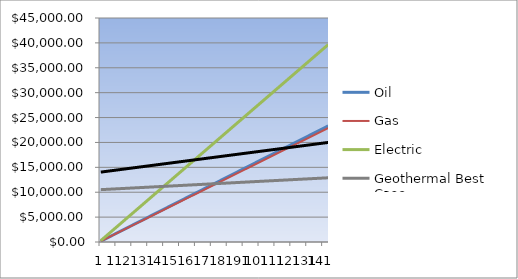
| Category | Oil | Gas | Electric | Geothermal Best Case | Geothermal Worst Case |
|---|---|---|---|---|---|
| 0 | 162 | 158.98 | 275.4 | 10516.66 | 14041.66 |
| 1 | 324 | 317.96 | 550.8 | 10533.32 | 14083.32 |
| 2 | 486 | 476.94 | 826.2 | 10549.98 | 14124.98 |
| 3 | 648 | 635.92 | 1101.6 | 10566.64 | 14166.64 |
| 4 | 810 | 794.9 | 1377 | 10583.3 | 14208.3 |
| 5 | 972 | 953.88 | 1652.4 | 10599.96 | 14249.96 |
| 6 | 1134 | 1112.86 | 1927.8 | 10616.62 | 14291.62 |
| 7 | 1296 | 1271.84 | 2203.2 | 10633.28 | 14333.28 |
| 8 | 1458 | 1430.82 | 2478.6 | 10649.94 | 14374.94 |
| 9 | 1620 | 1589.8 | 2754 | 10666.6 | 14416.6 |
| 10 | 1782 | 1748.78 | 3029.4 | 10683.26 | 14458.26 |
| 11 | 1944 | 1907.76 | 3304.8 | 10699.92 | 14499.92 |
| 12 | 2106 | 2066.74 | 3580.2 | 10716.58 | 14541.58 |
| 13 | 2268 | 2225.72 | 3855.6 | 10733.24 | 14583.24 |
| 14 | 2430 | 2384.7 | 4131 | 10749.9 | 14624.9 |
| 15 | 2592 | 2543.68 | 4406.4 | 10766.56 | 14666.56 |
| 16 | 2754 | 2702.66 | 4681.8 | 10783.22 | 14708.22 |
| 17 | 2916 | 2861.64 | 4957.2 | 10799.88 | 14749.88 |
| 18 | 3078 | 3020.62 | 5232.6 | 10816.54 | 14791.54 |
| 19 | 3240 | 3179.6 | 5508 | 10833.2 | 14833.2 |
| 20 | 3402 | 3338.58 | 5783.4 | 10849.86 | 14874.86 |
| 21 | 3564 | 3497.56 | 6058.8 | 10866.52 | 14916.52 |
| 22 | 3726 | 3656.54 | 6334.2 | 10883.18 | 14958.18 |
| 23 | 3888 | 3815.52 | 6609.6 | 10899.84 | 14999.84 |
| 24 | 4050 | 3974.5 | 6885 | 10916.5 | 15041.5 |
| 25 | 4212 | 4133.48 | 7160.4 | 10933.16 | 15083.16 |
| 26 | 4374 | 4292.46 | 7435.8 | 10949.82 | 15124.82 |
| 27 | 4536 | 4451.44 | 7711.2 | 10966.48 | 15166.48 |
| 28 | 4698 | 4610.42 | 7986.6 | 10983.14 | 15208.14 |
| 29 | 4860 | 4769.4 | 8262 | 10999.8 | 15249.8 |
| 30 | 5022 | 4928.38 | 8537.4 | 11016.46 | 15291.46 |
| 31 | 5184 | 5087.36 | 8812.8 | 11033.12 | 15333.12 |
| 32 | 5346 | 5246.34 | 9088.2 | 11049.78 | 15374.78 |
| 33 | 5508 | 5405.32 | 9363.6 | 11066.44 | 15416.44 |
| 34 | 5670 | 5564.3 | 9639 | 11083.1 | 15458.1 |
| 35 | 5832 | 5723.28 | 9914.4 | 11099.76 | 15499.76 |
| 36 | 5994 | 5882.26 | 10189.8 | 11116.42 | 15541.42 |
| 37 | 6156 | 6041.24 | 10465.2 | 11133.08 | 15583.08 |
| 38 | 6318 | 6200.22 | 10740.6 | 11149.74 | 15624.74 |
| 39 | 6480 | 6359.2 | 11016 | 11166.4 | 15666.4 |
| 40 | 6642 | 6518.18 | 11291.4 | 11183.06 | 15708.06 |
| 41 | 6804 | 6677.16 | 11566.8 | 11199.72 | 15749.72 |
| 42 | 6966 | 6836.14 | 11842.2 | 11216.38 | 15791.38 |
| 43 | 7128 | 6995.12 | 12117.6 | 11233.04 | 15833.04 |
| 44 | 7290 | 7154.1 | 12393 | 11249.7 | 15874.7 |
| 45 | 7452 | 7313.08 | 12668.4 | 11266.36 | 15916.36 |
| 46 | 7614 | 7472.06 | 12943.8 | 11283.02 | 15958.02 |
| 47 | 7776 | 7631.04 | 13219.2 | 11299.68 | 15999.68 |
| 48 | 7938 | 7790.02 | 13494.6 | 11316.34 | 16041.34 |
| 49 | 8100 | 7949 | 13770 | 11333 | 16083 |
| 50 | 8262 | 8107.98 | 14045.4 | 11349.66 | 16124.66 |
| 51 | 8424 | 8266.96 | 14320.8 | 11366.32 | 16166.32 |
| 52 | 8586 | 8425.94 | 14596.2 | 11382.98 | 16207.98 |
| 53 | 8748 | 8584.92 | 14871.6 | 11399.64 | 16249.64 |
| 54 | 8910 | 8743.9 | 15147 | 11416.3 | 16291.3 |
| 55 | 9072 | 8902.88 | 15422.4 | 11432.96 | 16332.96 |
| 56 | 9234 | 9061.86 | 15697.8 | 11449.62 | 16374.62 |
| 57 | 9396 | 9220.84 | 15973.2 | 11466.28 | 16416.28 |
| 58 | 9558 | 9379.82 | 16248.6 | 11482.94 | 16457.94 |
| 59 | 9720 | 9538.8 | 16524 | 11499.6 | 16499.6 |
| 60 | 9882 | 9697.78 | 16799.4 | 11516.26 | 16541.26 |
| 61 | 10044 | 9856.76 | 17074.8 | 11532.92 | 16582.92 |
| 62 | 10206 | 10015.74 | 17350.2 | 11549.58 | 16624.58 |
| 63 | 10368 | 10174.72 | 17625.6 | 11566.24 | 16666.24 |
| 64 | 10530 | 10333.7 | 17901 | 11582.9 | 16707.9 |
| 65 | 10692 | 10492.68 | 18176.4 | 11599.56 | 16749.56 |
| 66 | 10854 | 10651.66 | 18451.8 | 11616.22 | 16791.22 |
| 67 | 11016 | 10810.64 | 18727.2 | 11632.88 | 16832.88 |
| 68 | 11178 | 10969.62 | 19002.6 | 11649.54 | 16874.54 |
| 69 | 11340 | 11128.6 | 19278 | 11666.2 | 16916.2 |
| 70 | 11502 | 11287.58 | 19553.4 | 11682.86 | 16957.86 |
| 71 | 11664 | 11446.56 | 19828.8 | 11699.52 | 16999.52 |
| 72 | 11826 | 11605.54 | 20104.2 | 11716.18 | 17041.18 |
| 73 | 11988 | 11764.52 | 20379.6 | 11732.84 | 17082.84 |
| 74 | 12150 | 11923.5 | 20655 | 11749.5 | 17124.5 |
| 75 | 12312 | 12082.48 | 20930.4 | 11766.16 | 17166.16 |
| 76 | 12474 | 12241.46 | 21205.8 | 11782.82 | 17207.82 |
| 77 | 12636 | 12400.44 | 21481.2 | 11799.48 | 17249.48 |
| 78 | 12798 | 12559.42 | 21756.6 | 11816.14 | 17291.14 |
| 79 | 12960 | 12718.4 | 22032 | 11832.8 | 17332.8 |
| 80 | 13122 | 12877.38 | 22307.4 | 11849.46 | 17374.46 |
| 81 | 13284 | 13036.36 | 22582.8 | 11866.12 | 17416.12 |
| 82 | 13446 | 13195.34 | 22858.2 | 11882.78 | 17457.78 |
| 83 | 13608 | 13354.32 | 23133.6 | 11899.44 | 17499.44 |
| 84 | 13770 | 13513.3 | 23409 | 11916.1 | 17541.1 |
| 85 | 13932 | 13672.28 | 23684.4 | 11932.76 | 17582.76 |
| 86 | 14094 | 13831.26 | 23959.8 | 11949.42 | 17624.42 |
| 87 | 14256 | 13990.24 | 24235.2 | 11966.08 | 17666.08 |
| 88 | 14418 | 14149.22 | 24510.6 | 11982.74 | 17707.74 |
| 89 | 14580 | 14308.2 | 24786 | 11999.4 | 17749.4 |
| 90 | 14742 | 14467.18 | 25061.4 | 12016.06 | 17791.06 |
| 91 | 14904 | 14626.16 | 25336.8 | 12032.72 | 17832.72 |
| 92 | 15066 | 14785.14 | 25612.2 | 12049.38 | 17874.38 |
| 93 | 15228 | 14944.12 | 25887.6 | 12066.04 | 17916.04 |
| 94 | 15390 | 15103.1 | 26163 | 12082.7 | 17957.7 |
| 95 | 15552 | 15262.08 | 26438.4 | 12099.36 | 17999.36 |
| 96 | 15714 | 15421.06 | 26713.8 | 12116.02 | 18041.02 |
| 97 | 15876 | 15580.04 | 26989.2 | 12132.68 | 18082.68 |
| 98 | 16038 | 15739.02 | 27264.6 | 12149.34 | 18124.34 |
| 99 | 16200 | 15898 | 27540 | 12166 | 18166 |
| 100 | 16362 | 16056.98 | 27815.4 | 12182.66 | 18207.66 |
| 101 | 16524 | 16215.96 | 28090.8 | 12199.32 | 18249.32 |
| 102 | 16686 | 16374.94 | 28366.2 | 12215.98 | 18290.98 |
| 103 | 16848 | 16533.92 | 28641.6 | 12232.64 | 18332.64 |
| 104 | 17010 | 16692.9 | 28917 | 12249.3 | 18374.3 |
| 105 | 17172 | 16851.88 | 29192.4 | 12265.96 | 18415.96 |
| 106 | 17334 | 17010.86 | 29467.8 | 12282.62 | 18457.62 |
| 107 | 17496 | 17169.84 | 29743.2 | 12299.28 | 18499.28 |
| 108 | 17658 | 17328.82 | 30018.6 | 12315.94 | 18540.94 |
| 109 | 17820 | 17487.8 | 30294 | 12332.6 | 18582.6 |
| 110 | 17982 | 17646.78 | 30569.4 | 12349.26 | 18624.26 |
| 111 | 18144 | 17805.76 | 30844.8 | 12365.92 | 18665.92 |
| 112 | 18306 | 17964.74 | 31120.2 | 12382.58 | 18707.58 |
| 113 | 18468 | 18123.72 | 31395.6 | 12399.24 | 18749.24 |
| 114 | 18630 | 18282.7 | 31671 | 12415.9 | 18790.9 |
| 115 | 18792 | 18441.68 | 31946.4 | 12432.56 | 18832.56 |
| 116 | 18954 | 18600.66 | 32221.8 | 12449.22 | 18874.22 |
| 117 | 19116 | 18759.64 | 32497.2 | 12465.88 | 18915.88 |
| 118 | 19278 | 18918.62 | 32772.6 | 12482.54 | 18957.54 |
| 119 | 19440 | 19077.6 | 33048 | 12499.2 | 18999.2 |
| 120 | 19602 | 19236.58 | 33323.4 | 12515.86 | 19040.86 |
| 121 | 19764 | 19395.56 | 33598.8 | 12532.52 | 19082.52 |
| 122 | 19926 | 19554.54 | 33874.2 | 12549.18 | 19124.18 |
| 123 | 20088 | 19713.52 | 34149.6 | 12565.84 | 19165.84 |
| 124 | 20250 | 19872.5 | 34425 | 12582.5 | 19207.5 |
| 125 | 20412 | 20031.48 | 34700.4 | 12599.16 | 19249.16 |
| 126 | 20574 | 20190.46 | 34975.8 | 12615.82 | 19290.82 |
| 127 | 20736 | 20349.44 | 35251.2 | 12632.48 | 19332.48 |
| 128 | 20898 | 20508.42 | 35526.6 | 12649.14 | 19374.14 |
| 129 | 21060 | 20667.4 | 35802 | 12665.8 | 19415.8 |
| 130 | 21222 | 20826.38 | 36077.4 | 12682.46 | 19457.46 |
| 131 | 21384 | 20985.36 | 36352.8 | 12699.12 | 19499.12 |
| 132 | 21546 | 21144.34 | 36628.2 | 12715.78 | 19540.78 |
| 133 | 21708 | 21303.32 | 36903.6 | 12732.44 | 19582.44 |
| 134 | 21870 | 21462.3 | 37179 | 12749.1 | 19624.1 |
| 135 | 22032 | 21621.28 | 37454.4 | 12765.76 | 19665.76 |
| 136 | 22194 | 21780.26 | 37729.8 | 12782.42 | 19707.42 |
| 137 | 22356 | 21939.24 | 38005.2 | 12799.08 | 19749.08 |
| 138 | 22518 | 22098.22 | 38280.6 | 12815.74 | 19790.74 |
| 139 | 22680 | 22257.2 | 38556 | 12832.4 | 19832.4 |
| 140 | 22842 | 22416.18 | 38831.4 | 12849.06 | 19874.06 |
| 141 | 23004 | 22575.16 | 39106.8 | 12865.72 | 19915.72 |
| 142 | 23166 | 22734.14 | 39382.2 | 12882.38 | 19957.38 |
| 143 | 23328 | 22893.12 | 39657.6 | 12899.04 | 19999.04 |